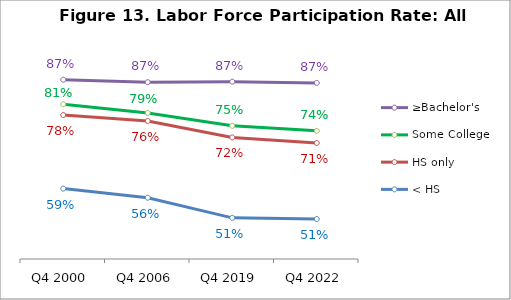
| Category | ≥Bachelor's | Some College | HS only | < HS |
|---|---|---|---|---|
| Q4 2000 | 0.874 | 0.809 | 0.781 | 0.586 |
| Q4 2006 | 0.867 | 0.786 | 0.765 | 0.562 |
| Q4 2019 | 0.869 | 0.752 | 0.721 | 0.509 |
| Q4 2022 | 0.865 | 0.739 | 0.707 | 0.506 |